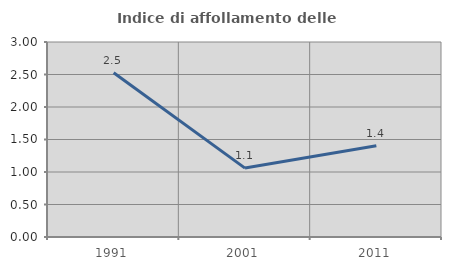
| Category | Indice di affollamento delle abitazioni  |
|---|---|
| 1991.0 | 2.527 |
| 2001.0 | 1.06 |
| 2011.0 | 1.404 |